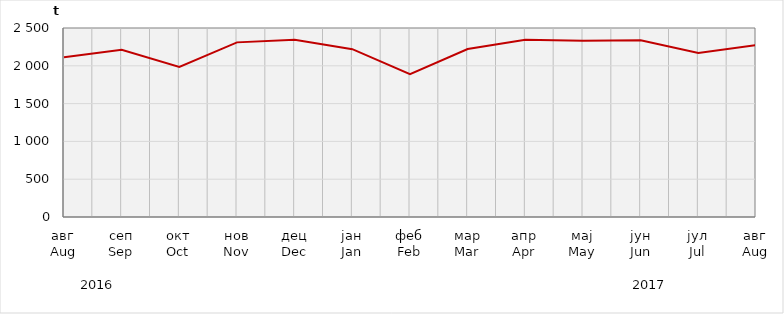
| Category | Нето тежина заклане стоке                              Net weight of  slaughtered livestock |
|---|---|
| авг
Aug | 2114109.78 |
| сеп
Sep | 2211725.58 |
| окт
Oct | 1985741.43 |
| нов
Nov | 2309850.52 |
| дец
Dec | 2344927.28 |
| јан
Jan | 2220030.9 |
| феб
Feb | 1890056.65 |
| мар
Mar | 2221281.4 |
| апр
Apr | 2344899.97 |
| мај
May | 2330965.85 |
| јун
Jun | 2337255.83 |
| јул
Jul | 2169976.6 |
| авг
Aug | 2273238.2 |